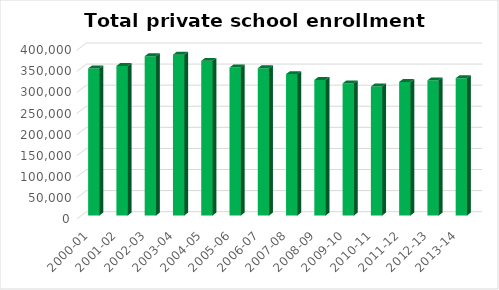
| Category | Series 0 |
|---|---|
| 2000-01 | 348736 |
| 2001-02 | 354541 |
| 2002-03 | 377701 |
| 2003-04 | 381346 |
| 2004-05 | 366742 |
| 2005-06 | 350827 |
| 2006-07 | 349059 |
| 2007-08 | 335211 |
| 2008-09 | 321298 |
| 2009-10 | 313291 |
| 2010-11 | 305825 |
| 2011-12 | 316745 |
| 2012-13 | 320423 |
| 2013-14 | 325502 |